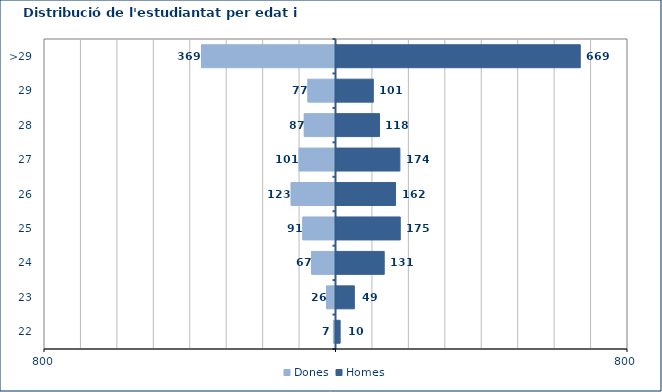
| Category | Dones | Homes |
|---|---|---|
| 22 | -7 | 10 |
| 23 | -26 | 49 |
| 24 | -67 | 131 |
| 25 | -91 | 175 |
| 26 | -123 | 162 |
| 27 | -101 | 174 |
| 28 | -87 | 118 |
| 29 | -77 | 101 |
| >29 | -369 | 669 |